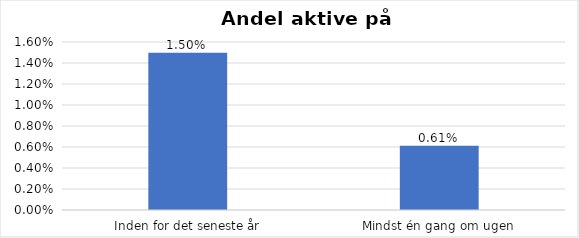
| Category | % |
|---|---|
| Inden for det seneste år | 0.015 |
| Mindst én gang om ugen | 0.006 |